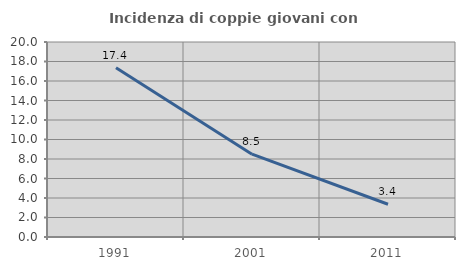
| Category | Incidenza di coppie giovani con figli |
|---|---|
| 1991.0 | 17.358 |
| 2001.0 | 8.494 |
| 2011.0 | 3.361 |